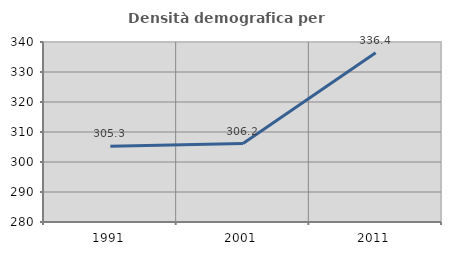
| Category | Densità demografica |
|---|---|
| 1991.0 | 305.256 |
| 2001.0 | 306.152 |
| 2011.0 | 336.417 |